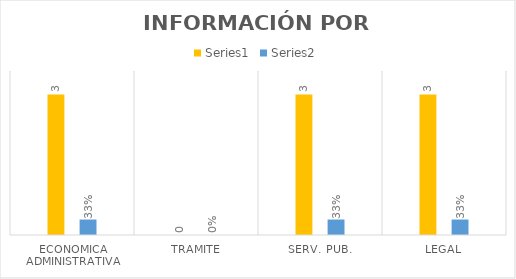
| Category | Series 3 | Series 4 |
|---|---|---|
| ECONOMICA ADMINISTRATIVA | 3 | 0.33 |
| TRAMITE | 0 | 0 |
| SERV. PUB. | 3 | 0.33 |
| LEGAL | 3 | 0.33 |